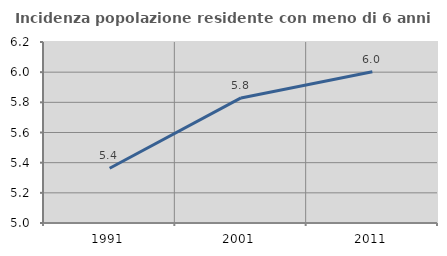
| Category | Incidenza popolazione residente con meno di 6 anni |
|---|---|
| 1991.0 | 5.363 |
| 2001.0 | 5.829 |
| 2011.0 | 6.003 |